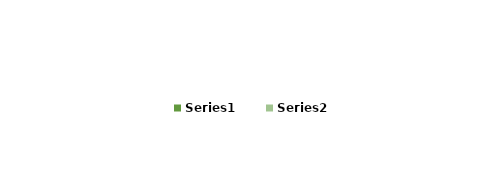
| Category | Series 0 | Series 1 |
|---|---|---|
| 0 | 0.576 | 0.424 |